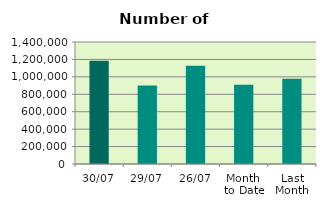
| Category | Series 0 |
|---|---|
| 30/07 | 1184400 |
| 29/07 | 899558 |
| 26/07 | 1126192 |
| Month 
to Date | 910216.182 |
| Last
Month | 977938.2 |